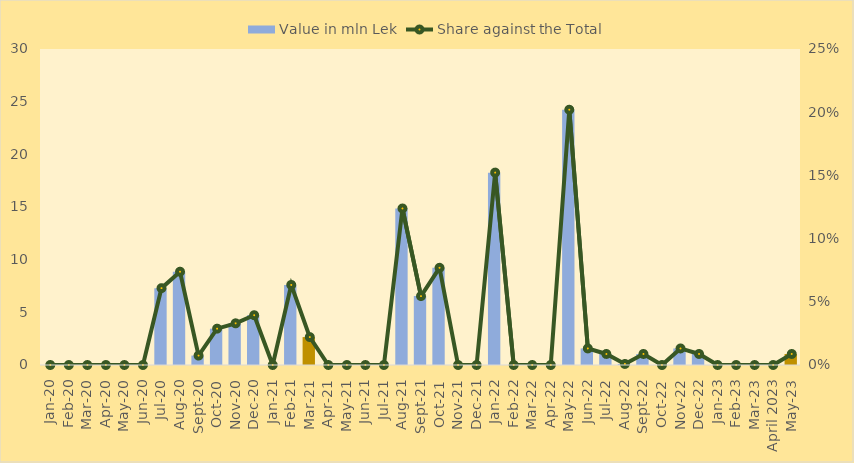
| Category | Value in mln Lek |
|---|---|
| Jan-20 | 0 |
| Feb-20 | 0 |
| Mar-20 | 0 |
| Apr-20 | 0 |
| May-20 | 0 |
| Jun-20 | 0 |
| Jul-20 | 7.295 |
| Aug-20 | 8.855 |
| Sep-20 | 0.895 |
| Oct-20 | 3.45 |
| Nov-20 | 3.955 |
| Dec-20 | 4.725 |
| Jan-21 | 0 |
| Feb-21 | 7.6 |
| Mar-21 | 2.65 |
| Apr-21 | 0 |
| May-21 | 0 |
| Jun-21 | 0 |
| Jul-21 | 0 |
| Aug-21 | 14.855 |
| Sep-21 | 6.54 |
| Oct-21 | 9.224 |
| Nov-21 | 0 |
| Dec-21 | 0 |
| Jan-22 | 18.262 |
| Feb-22 | 0 |
| Mar-22 | 0 |
| Apr-22 | 0 |
| May-22 | 24.227 |
| Jun-22 | 1.571 |
| Jul-22 | 1.047 |
| Aug-22 | 0.1 |
| Sep-22 | 1.047 |
| Oct-22 | 0 |
| Nov-22 | 1.571 |
| Dec-22 | 1.047 |
| Jan-23 | 0 |
| Feb-23 | 0 |
| Mar-23 | 0 |
| April 2023 | 0 |
| May-23 | 1.047 |